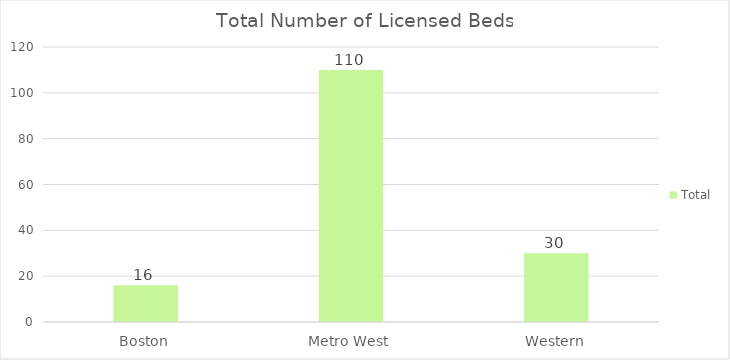
| Category | Total |
|---|---|
| Boston | 16 |
| Metro West | 110 |
| Western | 30 |